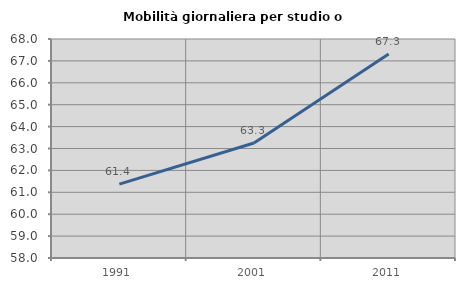
| Category | Mobilità giornaliera per studio o lavoro |
|---|---|
| 1991.0 | 61.375 |
| 2001.0 | 63.253 |
| 2011.0 | 67.314 |